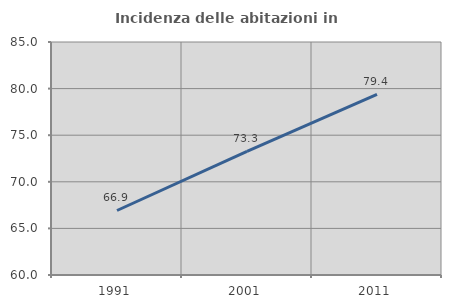
| Category | Incidenza delle abitazioni in proprietà  |
|---|---|
| 1991.0 | 66.921 |
| 2001.0 | 73.26 |
| 2011.0 | 79.389 |